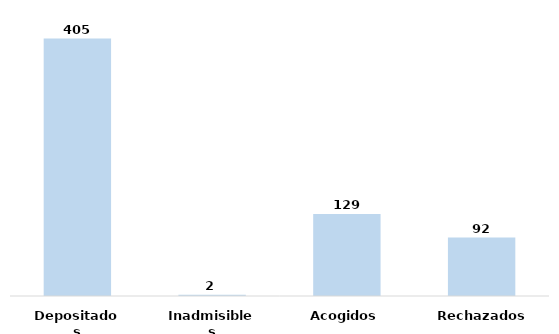
| Category | Series 0 |
|---|---|
| Depositados | 405 |
| Inadmisibles | 2 |
| Acogidos | 129 |
| Rechazados | 92 |